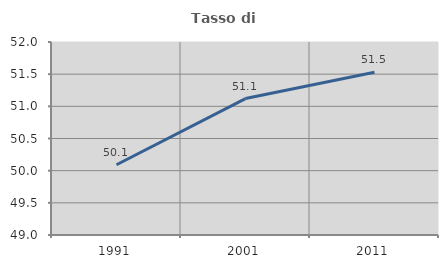
| Category | Tasso di occupazione   |
|---|---|
| 1991.0 | 50.092 |
| 2001.0 | 51.121 |
| 2011.0 | 51.529 |